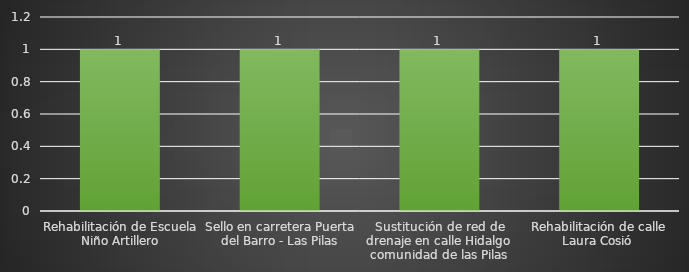
| Category | INDICADOR  |
|---|---|
| Rehabilitación de Escuela Niño Artillero | 1 |
| Sello en carretera Puerta del Barro - Las Pilas | 1 |
| Sustitución de red de drenaje en calle Hidalgo comunidad de las Pilas | 1 |
| Rehabilitación de calle Laura Cosió  | 1 |